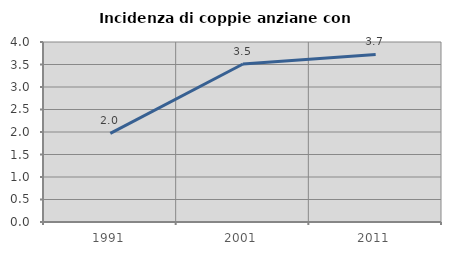
| Category | Incidenza di coppie anziane con figli |
|---|---|
| 1991.0 | 1.968 |
| 2001.0 | 3.51 |
| 2011.0 | 3.723 |